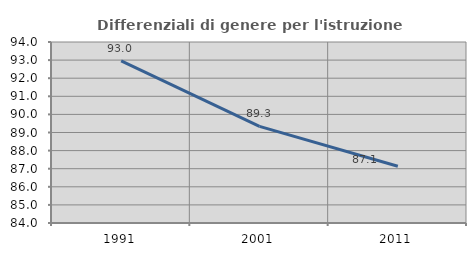
| Category | Differenziali di genere per l'istruzione superiore |
|---|---|
| 1991.0 | 92.959 |
| 2001.0 | 89.337 |
| 2011.0 | 87.133 |